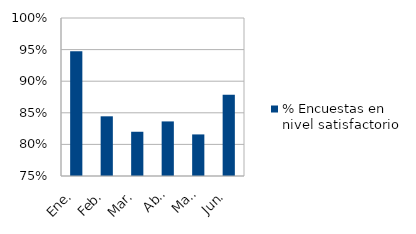
| Category | % Encuestas en nivel satisfactorio |
|---|---|
| Ene. | 0.947 |
| Feb. | 0.844 |
| Mar. | 0.82 |
| Abr. | 0.836 |
| May. | 0.816 |
| Jun. | 0.878 |